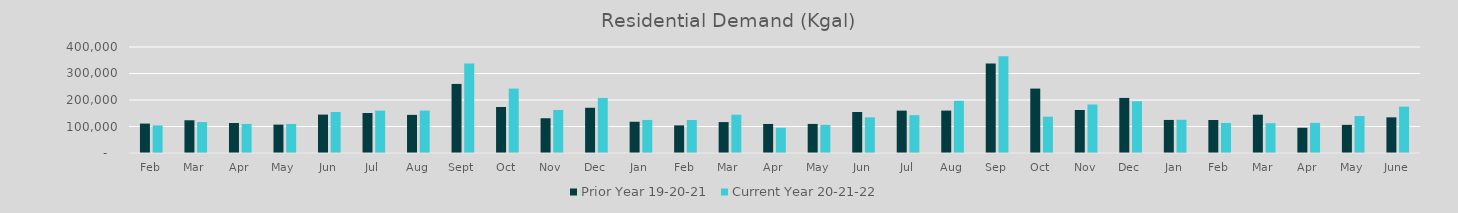
| Category | Prior Year 19-20-21 | Current Year 20-21-22 |
|---|---|---|
| Feb | 111009.962 | 104204.224 |
| Mar | 123525.131 | 116687.491 |
| Apr | 113258.787 | 109598.965 |
| May | 107128.051 | 109656.015 |
| Jun | 144930.453 | 154696.236 |
| Jul | 151028.014 | 159889.353 |
| Aug | 143816.337 | 160013.985 |
| Sep | 260607.456 | 337995.641 |
| Oct | 173601.368 | 243049.084 |
| Nov | 131198.833 | 162175.563 |
| Dec | 170629.384 | 207737.904 |
| Jan | 117899.625 | 124779.797 |
| Feb | 104204.224 | 124538.238 |
| Mar | 116687.491 | 144510.137 |
| Apr | 109598.965 | 95313.825 |
| May | 109656.015 | 106271.913 |
| Jun | 154696.236 | 134556.172 |
| Jul | 159889.353 | 142779.003 |
| Aug | 160013.985 | 196888.231 |
| Sep | 337995.641 | 364911.478 |
| Oct | 243049.084 | 137121.969 |
| Nov | 162175.563 | 182996.966 |
| Dec | 207737.904 | 195285.925 |
| Jan | 124779.797 | 125449.092 |
| Feb | 124538.238 | 113415.44 |
| Mar | 144510.137 | 112550.393 |
| Apr | 95313.825 | 113675.535 |
| May | 106271.913 | 139571.108 |
| June | 134556.172 | 175001.205 |